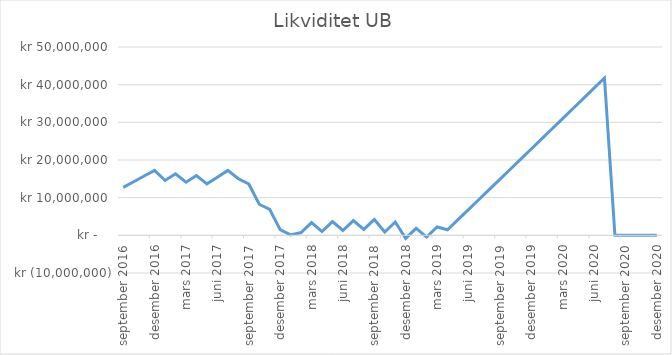
| Category | Likviditet UB |
|---|---|
| 2016-09-01 | 12725513.125 |
| 2016-10-01 | 14230966.571 |
| 2016-11-01 | 15737360.925 |
| 2016-12-01 | 17244696.775 |
| 2017-01-01 | 14567333.333 |
| 2017-02-01 | 16335771.25 |
| 2017-03-01 | 14111147.774 |
| 2017-04-01 | 15885133.908 |
| 2017-05-01 | 13666062.116 |
| 2017-06-01 | 15445603.405 |
| 2017-07-01 | 17226256.907 |
| 2017-08-01 | 15013856.651 |
| 2017-09-01 | 13633073.645 |
| 2017-10-01 | 8257260.983 |
| 2017-11-01 | 6878088.437 |
| 2017-12-01 | 1503887.243 |
| 2018-01-01 | 126327.172 |
| 2018-02-01 | 750822.793 |
| 2018-03-01 | 3375708.724 |
| 2018-04-01 | 1009526.876 |
| 2018-05-01 | 3641866.163 |
| 2018-06-01 | 1283142.33 |
| 2018-07-01 | 3922944.294 |
| 2018-08-01 | 1571687.8 |
| 2018-09-01 | 4218961.772 |
| 2018-10-01 | 876640.29 |
| 2018-11-01 | 3532229.857 |
| 2018-12-01 | -800312.5 |
| 2019-01-01 | 1864437.305 |
| 2019-02-01 | -461855.755 |
| 2019-03-01 | 2210397.252 |
| 2019-04-01 | 1474778.75 |
| 2019-05-01 | 4149700.487 |
| 2019-06-01 | 6826294.05 |
| 2019-07-01 | 9504560.483 |
| 2019-08-01 | 12184500.834 |
| 2019-09-01 | 14866116.147 |
| 2019-10-01 | 17549407.469 |
| 2019-11-01 | 20234375.849 |
| 2019-12-01 | 22921022.334 |
| 2020-01-01 | 25609347.973 |
| 2020-02-01 | 28299353.815 |
| 2020-03-01 | 30991040.911 |
| 2020-04-01 | 33684410.312 |
| 2020-05-01 | 36379463.068 |
| 2020-06-01 | 39076200.233 |
| 2020-07-01 | 41774622.858 |
| 2020-08-01 | 0 |
| 2020-09-01 | 0 |
| 2020-10-01 | 0 |
| 2020-11-01 | 0 |
| 2020-12-01 | 0 |